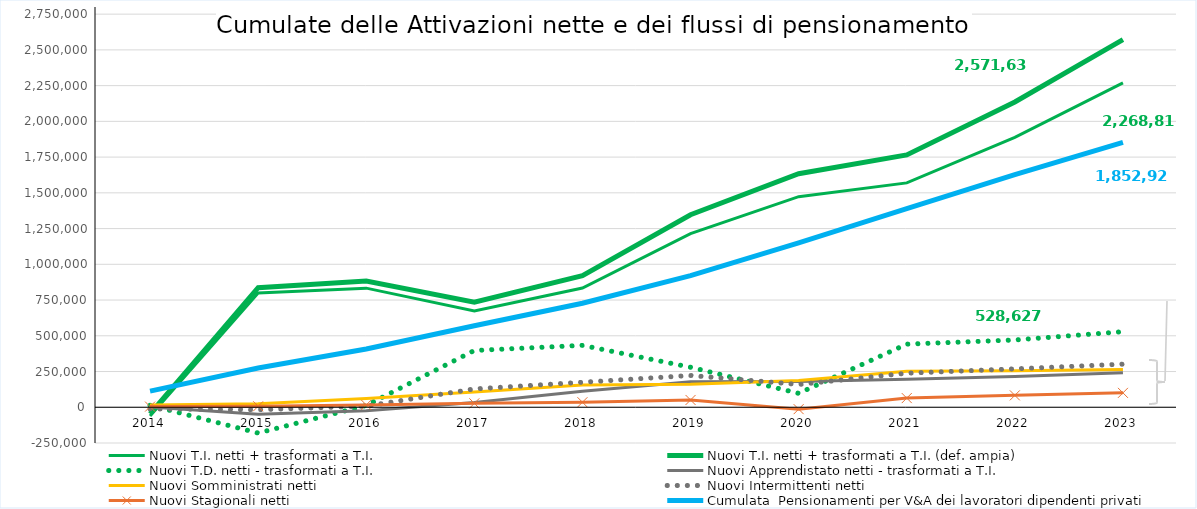
| Category | Nuovi T.I. netti + trasformati a T.I. | Nuovi T.I. netti + trasformati a T.I. (def. ampia) | Nuovi T.D. netti - trasformati a T.I.  | Nuovi Apprendistato netti - trasformati a T.I. | Nuovi Somministrati netti | Nuovi Intermittenti netti | Nuovi Stagionali netti  | Cumulata  Pensionamenti per V&A dei lavoratori dipendenti privati |
|---|---|---|---|---|---|---|---|---|
| 2014.0 | -60562 | -46833 | 13621 | 1150 | 15493 | -11300 | 4624 | 113074 |
| 2015.0 | 799568 | 836178 | -180384 | -49655 | 24450 | -17294 | 7127 | 274747 |
| 2016.0 | 833271 | 882801 | 12822 | -24422 | 61930 | 7993 | 16296 | 407965 |
| 2017.0 | 673665 | 734865 | 397176 | 33226 | 107323 | 128119 | 27584 | 569817 |
| 2018.0 | 833858 | 920862 | 432981 | 111881 | 156311 | 174849 | 35257 | 727541 |
| 2019.0 | 1215166 | 1347062 | 279834 | 178246 | 161437 | 222372 | 50991 | 920637 |
| 2020.0 | 1473344 | 1633279 | 97515 | 179561 | 187423 | 159467 | -13200 | 1149251 |
| 2021.0 | 1569719 | 1765109 | 441564 | 195364 | 251942 | 238302 | 64197 | 1389157 |
| 2022.0 | 1887824 | 2135528 | 470721 | 214456 | 255781 | 268742 | 83190 | 1627129 |
| 2023.0 | 2268812 | 2571630 | 528627 | 240654 | 263361 | 301566 | 100745 | 1852925 |